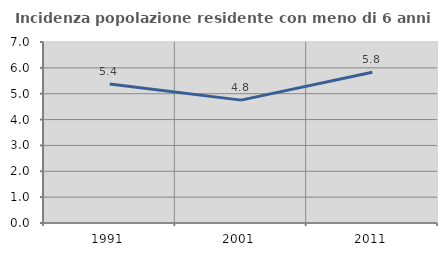
| Category | Incidenza popolazione residente con meno di 6 anni |
|---|---|
| 1991.0 | 5.375 |
| 2001.0 | 4.752 |
| 2011.0 | 5.829 |